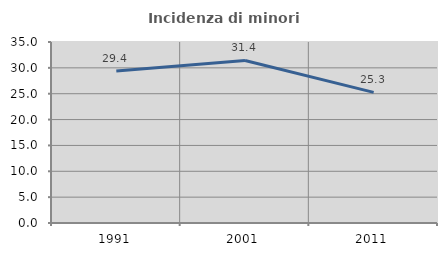
| Category | Incidenza di minori stranieri |
|---|---|
| 1991.0 | 29.412 |
| 2001.0 | 31.429 |
| 2011.0 | 25.253 |